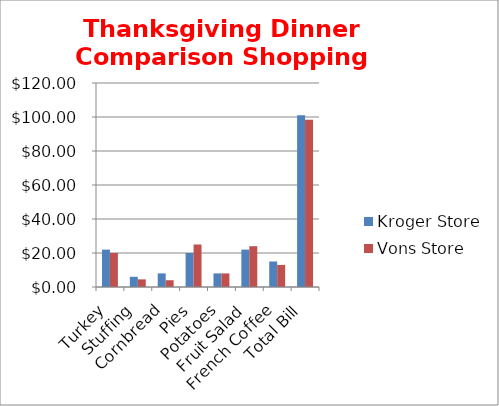
| Category | Kroger Store | Vons Store |
|---|---|---|
| Turkey | 21.99 | 19.99 |
| Stuffing | 6 | 4.49 |
| Cornbread | 8 | 3.99 |
| Pies | 20 | 24.99 |
| Potatoes | 8 | 7.98 |
| Fruit Salad | 22 | 24 |
| French Coffee | 15 | 12.99 |
| Total Bill | 100.99 | 98.43 |